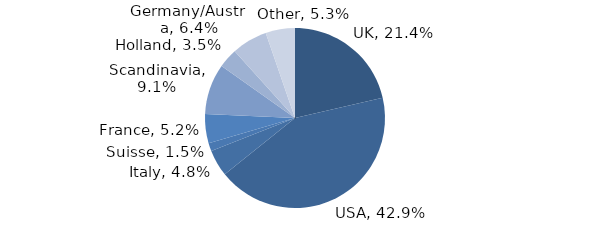
| Category | Investment Style |
|---|---|
| UK | 0.214 |
| USA | 0.429 |
| Italy | 0.048 |
| Suisse | 0.015 |
| France | 0.052 |
| Scandinavia | 0.091 |
| Holland | 0.035 |
| Germany/Austria | 0.064 |
| Other | 0.053 |